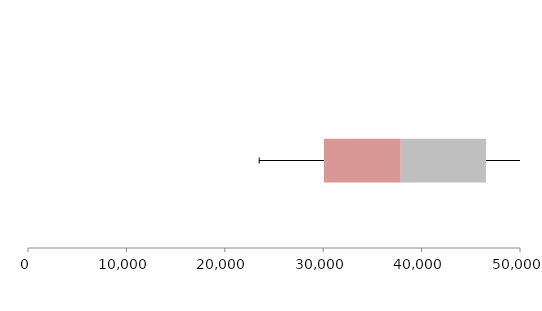
| Category | Series 1 | Series 2 | Series 3 |
|---|---|---|---|
| 0 | 30067.17 | 7810.908 | 8659.801 |